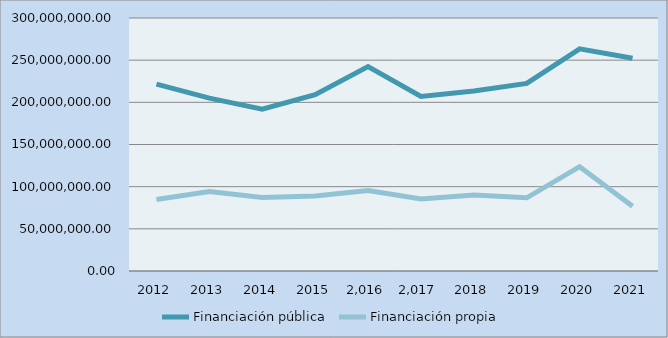
| Category | Financiación pública | Financiación propia |
|---|---|---|
| 2012.0 | 221610139.78 | 84766690.51 |
| 2013.0 | 205010670.56 | 94309800.69 |
| 2014.0 | 191902902.54 | 87204502.22 |
| 2015.0 | 208994692 | 88985007.36 |
| 2016.0 | 242445936.4 | 95421659.55 |
| 2017.0 | 206929790.58 | 85372037 |
| 2018.0 | 213559255.96 | 90256859.71 |
| 2019.0 | 222447830.65 | 86778677.95 |
| 2020.0 | 263377012.33 | 123755973.12 |
| 2021.0 | 252269862.04 | 76761673.65 |